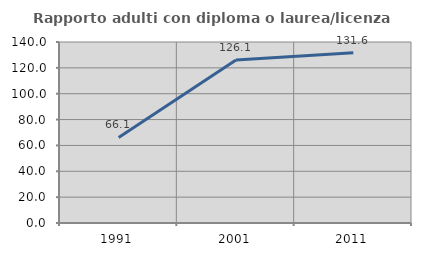
| Category | Rapporto adulti con diploma o laurea/licenza media  |
|---|---|
| 1991.0 | 66.148 |
| 2001.0 | 126.091 |
| 2011.0 | 131.649 |